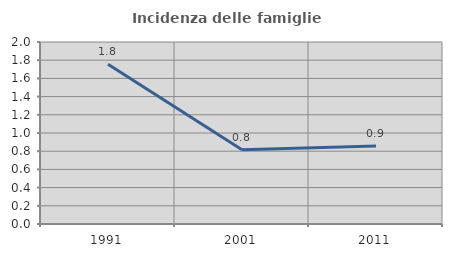
| Category | Incidenza delle famiglie numerose |
|---|---|
| 1991.0 | 1.754 |
| 2001.0 | 0.817 |
| 2011.0 | 0.857 |